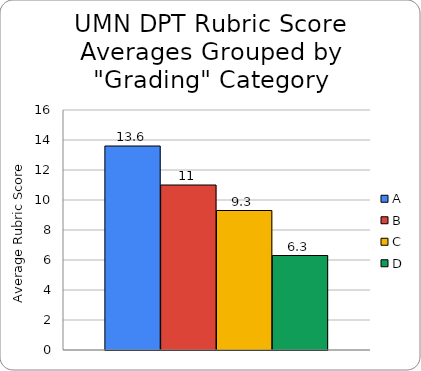
| Category | A | B | C | D |
|---|---|---|---|---|
|  | 13.6 | 11 | 9.3 | 6.3 |